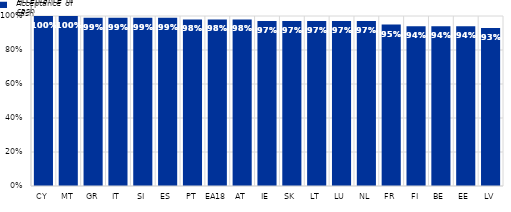
| Category | Acceptance of cash |
|---|---|
| CY | 1 |
| MT | 1 |
| GR | 0.99 |
| IT | 0.99 |
| SI | 0.99 |
| ES | 0.99 |
| PT | 0.98 |
| EA18 | 0.98 |
| AT | 0.98 |
| IE | 0.97 |
| SK | 0.97 |
| LT | 0.97 |
| LU | 0.97 |
| NL | 0.97 |
| FR | 0.95 |
| FI | 0.94 |
| BE | 0.94 |
| EE | 0.94 |
| LV | 0.93 |